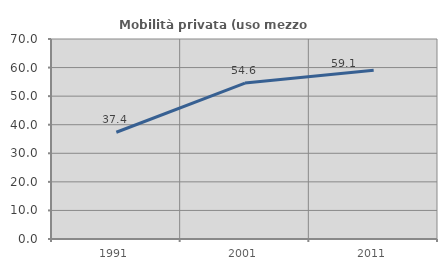
| Category | Mobilità privata (uso mezzo privato) |
|---|---|
| 1991.0 | 37.358 |
| 2001.0 | 54.578 |
| 2011.0 | 59.096 |